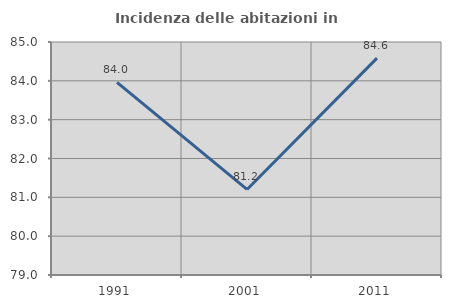
| Category | Incidenza delle abitazioni in proprietà  |
|---|---|
| 1991.0 | 83.962 |
| 2001.0 | 81.203 |
| 2011.0 | 84.584 |